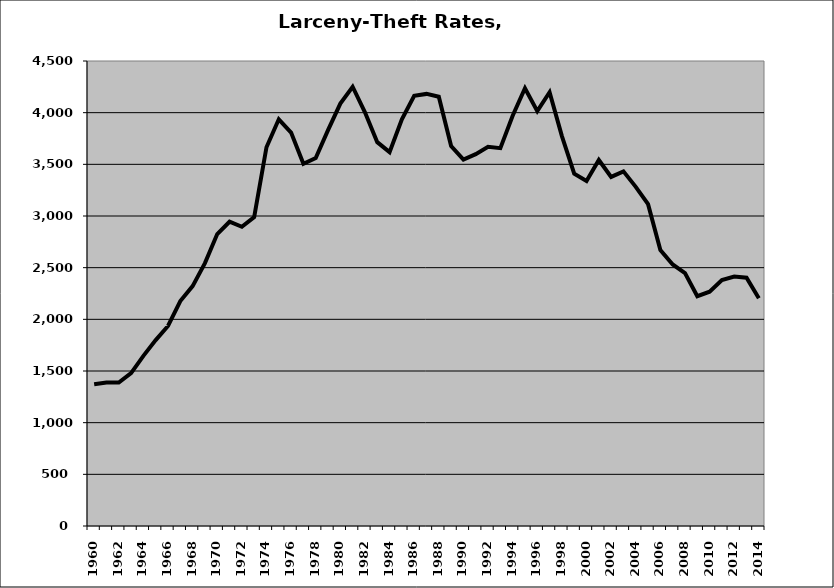
| Category | Larceny-Theft |
|---|---|
| 1960.0 | 1371.187 |
| 1961.0 | 1388.716 |
| 1962.0 | 1387.929 |
| 1963.0 | 1479.901 |
| 1964.0 | 1646.82 |
| 1965.0 | 1798.894 |
| 1966.0 | 1935.55 |
| 1967.0 | 2176.838 |
| 1968.0 | 2321.315 |
| 1969.0 | 2543.898 |
| 1970.0 | 2825.018 |
| 1971.0 | 2944.532 |
| 1972.0 | 2895.417 |
| 1973.0 | 2988.494 |
| 1974.0 | 3665.49 |
| 1975.0 | 3935.883 |
| 1976.0 | 3806.827 |
| 1977.0 | 3506.145 |
| 1978.0 | 3561.088 |
| 1979.0 | 3831.539 |
| 1980.0 | 4087.835 |
| 1981.0 | 4250.774 |
| 1982.0 | 4003.813 |
| 1983.0 | 3714.5 |
| 1984.0 | 3617.876 |
| 1985.0 | 3934.686 |
| 1986.0 | 4162.787 |
| 1987.0 | 4181.608 |
| 1988.0 | 4154.396 |
| 1989.0 | 3676.95 |
| 1990.0 | 3545.166 |
| 1991.0 | 3598.392 |
| 1992.0 | 3670.608 |
| 1993.0 | 3656.926 |
| 1994.0 | 3969.734 |
| 1995.0 | 4236.708 |
| 1996.0 | 4014.295 |
| 1997.0 | 4197.626 |
| 1998.0 | 3773.339 |
| 1999.0 | 3409.13 |
| 2000.0 | 3338.693 |
| 2001.0 | 3542.136 |
| 2002.0 | 3378.21 |
| 2003.0 | 3431.977 |
| 2004.0 | 3281.985 |
| 2005.0 | 3114.043 |
| 2006.0 | 2671.155 |
| 2007.0 | 2531.184 |
| 2008.0 | 2448.407 |
| 2009.0 | 2223.514 |
| 2010.0 | 2267.745 |
| 2011.0 | 2379.875 |
| 2012.0 | 2413.303 |
| 2013.0 | 2402.275 |
| 2014.0 | 2204.552 |